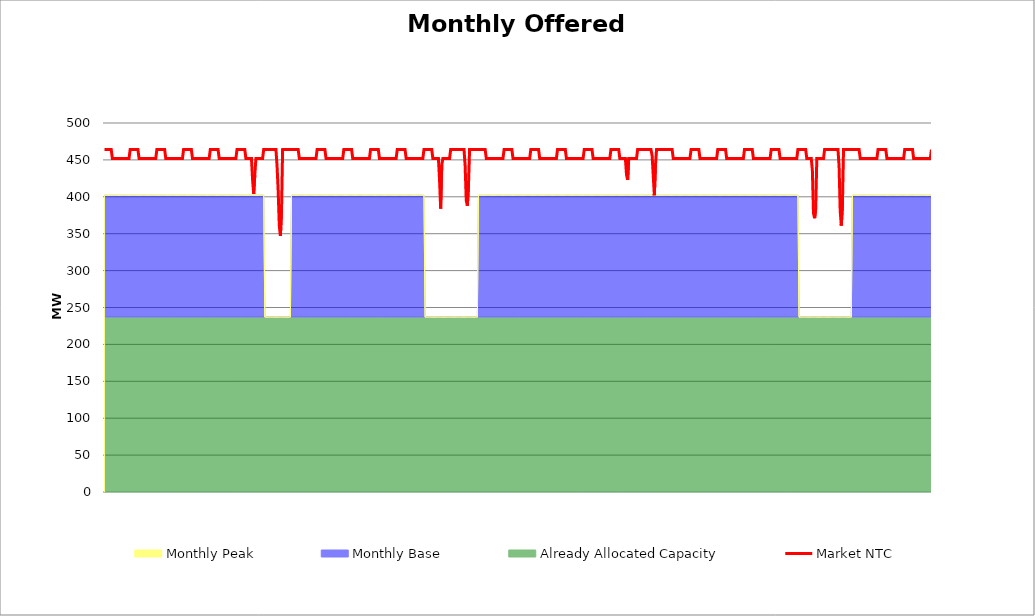
| Category | Market NTC |
|---|---|
| 0 | 464 |
| 1 | 464 |
| 2 | 464 |
| 3 | 464 |
| 4 | 464 |
| 5 | 464 |
| 6 | 464 |
| 7 | 452 |
| 8 | 452 |
| 9 | 452 |
| 10 | 452 |
| 11 | 452 |
| 12 | 452 |
| 13 | 452 |
| 14 | 452 |
| 15 | 452 |
| 16 | 452 |
| 17 | 452 |
| 18 | 452 |
| 19 | 452 |
| 20 | 452 |
| 21 | 452 |
| 22 | 452 |
| 23 | 464 |
| 24 | 464 |
| 25 | 464 |
| 26 | 464 |
| 27 | 464 |
| 28 | 464 |
| 29 | 464 |
| 30 | 464 |
| 31 | 452 |
| 32 | 452 |
| 33 | 452 |
| 34 | 452 |
| 35 | 452 |
| 36 | 452 |
| 37 | 452 |
| 38 | 452 |
| 39 | 452 |
| 40 | 452 |
| 41 | 452 |
| 42 | 452 |
| 43 | 452 |
| 44 | 452 |
| 45 | 452 |
| 46 | 452 |
| 47 | 464 |
| 48 | 464 |
| 49 | 464 |
| 50 | 464 |
| 51 | 464 |
| 52 | 464 |
| 53 | 464 |
| 54 | 464 |
| 55 | 452 |
| 56 | 452 |
| 57 | 452 |
| 58 | 452 |
| 59 | 452 |
| 60 | 452 |
| 61 | 452 |
| 62 | 452 |
| 63 | 452 |
| 64 | 452 |
| 65 | 452 |
| 66 | 452 |
| 67 | 452 |
| 68 | 452 |
| 69 | 452 |
| 70 | 452 |
| 71 | 464 |
| 72 | 464 |
| 73 | 464 |
| 74 | 464 |
| 75 | 464 |
| 76 | 464 |
| 77 | 464 |
| 78 | 464 |
| 79 | 452 |
| 80 | 452 |
| 81 | 452 |
| 82 | 452 |
| 83 | 452 |
| 84 | 452 |
| 85 | 452 |
| 86 | 452 |
| 87 | 452 |
| 88 | 452 |
| 89 | 452 |
| 90 | 452 |
| 91 | 452 |
| 92 | 452 |
| 93 | 452 |
| 94 | 452 |
| 95 | 464 |
| 96 | 464 |
| 97 | 464 |
| 98 | 464 |
| 99 | 464 |
| 100 | 464 |
| 101 | 464 |
| 102 | 464 |
| 103 | 452 |
| 104 | 452 |
| 105 | 452 |
| 106 | 452 |
| 107 | 452 |
| 108 | 452 |
| 109 | 452 |
| 110 | 452 |
| 111 | 452 |
| 112 | 452 |
| 113 | 452 |
| 114 | 452 |
| 115 | 452 |
| 116 | 452 |
| 117 | 452 |
| 118 | 452 |
| 119 | 464 |
| 120 | 464 |
| 121 | 464 |
| 122 | 464 |
| 123 | 464 |
| 124 | 464 |
| 125 | 464 |
| 126 | 464 |
| 127 | 452 |
| 128 | 452 |
| 129 | 452 |
| 130 | 452 |
| 131 | 452 |
| 132 | 452 |
| 133 | 423 |
| 134 | 404 |
| 135 | 430 |
| 136 | 452 |
| 137 | 452 |
| 138 | 452 |
| 139 | 452 |
| 140 | 452 |
| 141 | 452 |
| 142 | 452 |
| 143 | 464 |
| 144 | 464 |
| 145 | 464 |
| 146 | 464 |
| 147 | 464 |
| 148 | 464 |
| 149 | 464 |
| 150 | 464 |
| 151 | 464 |
| 152 | 464 |
| 153 | 464 |
| 154 | 464 |
| 155 | 442 |
| 156 | 408 |
| 157 | 361 |
| 158 | 347 |
| 159 | 381 |
| 160 | 464 |
| 161 | 464 |
| 162 | 464 |
| 163 | 464 |
| 164 | 464 |
| 165 | 464 |
| 166 | 464 |
| 167 | 464 |
| 168 | 464 |
| 169 | 464 |
| 170 | 464 |
| 171 | 464 |
| 172 | 464 |
| 173 | 464 |
| 174 | 464 |
| 175 | 452 |
| 176 | 452 |
| 177 | 452 |
| 178 | 452 |
| 179 | 452 |
| 180 | 452 |
| 181 | 452 |
| 182 | 452 |
| 183 | 452 |
| 184 | 452 |
| 185 | 452 |
| 186 | 452 |
| 187 | 452 |
| 188 | 452 |
| 189 | 452 |
| 190 | 452 |
| 191 | 464 |
| 192 | 464 |
| 193 | 464 |
| 194 | 464 |
| 195 | 464 |
| 196 | 464 |
| 197 | 464 |
| 198 | 464 |
| 199 | 452 |
| 200 | 452 |
| 201 | 452 |
| 202 | 452 |
| 203 | 452 |
| 204 | 452 |
| 205 | 452 |
| 206 | 452 |
| 207 | 452 |
| 208 | 452 |
| 209 | 452 |
| 210 | 452 |
| 211 | 452 |
| 212 | 452 |
| 213 | 452 |
| 214 | 452 |
| 215 | 464 |
| 216 | 464 |
| 217 | 464 |
| 218 | 464 |
| 219 | 464 |
| 220 | 464 |
| 221 | 464 |
| 222 | 464 |
| 223 | 452 |
| 224 | 452 |
| 225 | 452 |
| 226 | 452 |
| 227 | 452 |
| 228 | 452 |
| 229 | 452 |
| 230 | 452 |
| 231 | 452 |
| 232 | 452 |
| 233 | 452 |
| 234 | 452 |
| 235 | 452 |
| 236 | 452 |
| 237 | 452 |
| 238 | 452 |
| 239 | 464 |
| 240 | 464 |
| 241 | 464 |
| 242 | 464 |
| 243 | 464 |
| 244 | 464 |
| 245 | 464 |
| 246 | 464 |
| 247 | 452 |
| 248 | 452 |
| 249 | 452 |
| 250 | 452 |
| 251 | 452 |
| 252 | 452 |
| 253 | 452 |
| 254 | 452 |
| 255 | 452 |
| 256 | 452 |
| 257 | 452 |
| 258 | 452 |
| 259 | 452 |
| 260 | 452 |
| 261 | 452 |
| 262 | 452 |
| 263 | 464 |
| 264 | 464 |
| 265 | 464 |
| 266 | 464 |
| 267 | 464 |
| 268 | 464 |
| 269 | 464 |
| 270 | 464 |
| 271 | 452 |
| 272 | 452 |
| 273 | 452 |
| 274 | 452 |
| 275 | 452 |
| 276 | 452 |
| 277 | 452 |
| 278 | 452 |
| 279 | 452 |
| 280 | 452 |
| 281 | 452 |
| 282 | 452 |
| 283 | 452 |
| 284 | 452 |
| 285 | 452 |
| 286 | 452 |
| 287 | 464 |
| 288 | 464 |
| 289 | 464 |
| 290 | 464 |
| 291 | 464 |
| 292 | 464 |
| 293 | 464 |
| 294 | 464 |
| 295 | 452 |
| 296 | 452 |
| 297 | 452 |
| 298 | 452 |
| 299 | 452 |
| 300 | 452 |
| 301 | 423 |
| 302 | 384 |
| 303 | 443 |
| 304 | 452 |
| 305 | 452 |
| 306 | 452 |
| 307 | 452 |
| 308 | 452 |
| 309 | 452 |
| 310 | 452 |
| 311 | 464 |
| 312 | 464 |
| 313 | 464 |
| 314 | 464 |
| 315 | 464 |
| 316 | 464 |
| 317 | 464 |
| 318 | 464 |
| 319 | 464 |
| 320 | 464 |
| 321 | 464 |
| 322 | 464 |
| 323 | 464 |
| 324 | 442 |
| 325 | 395 |
| 326 | 388 |
| 327 | 415 |
| 328 | 464 |
| 329 | 464 |
| 330 | 464 |
| 331 | 464 |
| 332 | 464 |
| 333 | 464 |
| 334 | 464 |
| 335 | 464 |
| 336 | 464 |
| 337 | 464 |
| 338 | 464 |
| 339 | 464 |
| 340 | 464 |
| 341 | 464 |
| 342 | 464 |
| 343 | 452 |
| 344 | 452 |
| 345 | 452 |
| 346 | 452 |
| 347 | 452 |
| 348 | 452 |
| 349 | 452 |
| 350 | 452 |
| 351 | 452 |
| 352 | 452 |
| 353 | 452 |
| 354 | 452 |
| 355 | 452 |
| 356 | 452 |
| 357 | 452 |
| 358 | 452 |
| 359 | 464 |
| 360 | 464 |
| 361 | 464 |
| 362 | 464 |
| 363 | 464 |
| 364 | 464 |
| 365 | 464 |
| 366 | 464 |
| 367 | 452 |
| 368 | 452 |
| 369 | 452 |
| 370 | 452 |
| 371 | 452 |
| 372 | 452 |
| 373 | 452 |
| 374 | 452 |
| 375 | 452 |
| 376 | 452 |
| 377 | 452 |
| 378 | 452 |
| 379 | 452 |
| 380 | 452 |
| 381 | 452 |
| 382 | 452 |
| 383 | 464 |
| 384 | 464 |
| 385 | 464 |
| 386 | 464 |
| 387 | 464 |
| 388 | 464 |
| 389 | 464 |
| 390 | 464 |
| 391 | 452 |
| 392 | 452 |
| 393 | 452 |
| 394 | 452 |
| 395 | 452 |
| 396 | 452 |
| 397 | 452 |
| 398 | 452 |
| 399 | 452 |
| 400 | 452 |
| 401 | 452 |
| 402 | 452 |
| 403 | 452 |
| 404 | 452 |
| 405 | 452 |
| 406 | 452 |
| 407 | 464 |
| 408 | 464 |
| 409 | 464 |
| 410 | 464 |
| 411 | 464 |
| 412 | 464 |
| 413 | 464 |
| 414 | 464 |
| 415 | 452 |
| 416 | 452 |
| 417 | 452 |
| 418 | 452 |
| 419 | 452 |
| 420 | 452 |
| 421 | 452 |
| 422 | 452 |
| 423 | 452 |
| 424 | 452 |
| 425 | 452 |
| 426 | 452 |
| 427 | 452 |
| 428 | 452 |
| 429 | 452 |
| 430 | 452 |
| 431 | 464 |
| 432 | 464 |
| 433 | 464 |
| 434 | 464 |
| 435 | 464 |
| 436 | 464 |
| 437 | 464 |
| 438 | 464 |
| 439 | 452 |
| 440 | 452 |
| 441 | 452 |
| 442 | 452 |
| 443 | 452 |
| 444 | 452 |
| 445 | 452 |
| 446 | 452 |
| 447 | 452 |
| 448 | 452 |
| 449 | 452 |
| 450 | 452 |
| 451 | 452 |
| 452 | 452 |
| 453 | 452 |
| 454 | 452 |
| 455 | 464 |
| 456 | 464 |
| 457 | 464 |
| 458 | 464 |
| 459 | 464 |
| 460 | 464 |
| 461 | 464 |
| 462 | 464 |
| 463 | 452 |
| 464 | 452 |
| 465 | 452 |
| 466 | 452 |
| 467 | 452 |
| 468 | 452 |
| 469 | 430 |
| 470 | 423 |
| 471 | 452 |
| 472 | 452 |
| 473 | 452 |
| 474 | 452 |
| 475 | 452 |
| 476 | 452 |
| 477 | 452 |
| 478 | 452 |
| 479 | 464 |
| 480 | 464 |
| 481 | 464 |
| 482 | 464 |
| 483 | 464 |
| 484 | 464 |
| 485 | 464 |
| 486 | 464 |
| 487 | 464 |
| 488 | 464 |
| 489 | 464 |
| 490 | 464 |
| 491 | 464 |
| 492 | 456 |
| 493 | 429 |
| 494 | 402 |
| 495 | 442 |
| 496 | 464 |
| 497 | 464 |
| 498 | 464 |
| 499 | 464 |
| 500 | 464 |
| 501 | 464 |
| 502 | 464 |
| 503 | 464 |
| 504 | 464 |
| 505 | 464 |
| 506 | 464 |
| 507 | 464 |
| 508 | 464 |
| 509 | 464 |
| 510 | 464 |
| 511 | 452 |
| 512 | 452 |
| 513 | 452 |
| 514 | 452 |
| 515 | 452 |
| 516 | 452 |
| 517 | 452 |
| 518 | 452 |
| 519 | 452 |
| 520 | 452 |
| 521 | 452 |
| 522 | 452 |
| 523 | 452 |
| 524 | 452 |
| 525 | 452 |
| 526 | 452 |
| 527 | 464 |
| 528 | 464 |
| 529 | 464 |
| 530 | 464 |
| 531 | 464 |
| 532 | 464 |
| 533 | 464 |
| 534 | 464 |
| 535 | 452 |
| 536 | 452 |
| 537 | 452 |
| 538 | 452 |
| 539 | 452 |
| 540 | 452 |
| 541 | 452 |
| 542 | 452 |
| 543 | 452 |
| 544 | 452 |
| 545 | 452 |
| 546 | 452 |
| 547 | 452 |
| 548 | 452 |
| 549 | 452 |
| 550 | 452 |
| 551 | 464 |
| 552 | 464 |
| 553 | 464 |
| 554 | 464 |
| 555 | 464 |
| 556 | 464 |
| 557 | 464 |
| 558 | 464 |
| 559 | 452 |
| 560 | 452 |
| 561 | 452 |
| 562 | 452 |
| 563 | 452 |
| 564 | 452 |
| 565 | 452 |
| 566 | 452 |
| 567 | 452 |
| 568 | 452 |
| 569 | 452 |
| 570 | 452 |
| 571 | 452 |
| 572 | 452 |
| 573 | 452 |
| 574 | 452 |
| 575 | 464 |
| 576 | 464 |
| 577 | 464 |
| 578 | 464 |
| 579 | 464 |
| 580 | 464 |
| 581 | 464 |
| 582 | 464 |
| 583 | 452 |
| 584 | 452 |
| 585 | 452 |
| 586 | 452 |
| 587 | 452 |
| 588 | 452 |
| 589 | 452 |
| 590 | 452 |
| 591 | 452 |
| 592 | 452 |
| 593 | 452 |
| 594 | 452 |
| 595 | 452 |
| 596 | 452 |
| 597 | 452 |
| 598 | 452 |
| 599 | 464 |
| 600 | 464 |
| 601 | 464 |
| 602 | 464 |
| 603 | 464 |
| 604 | 464 |
| 605 | 464 |
| 606 | 464 |
| 607 | 452 |
| 608 | 452 |
| 609 | 452 |
| 610 | 452 |
| 611 | 452 |
| 612 | 452 |
| 613 | 452 |
| 614 | 452 |
| 615 | 452 |
| 616 | 452 |
| 617 | 452 |
| 618 | 452 |
| 619 | 452 |
| 620 | 452 |
| 621 | 452 |
| 622 | 452 |
| 623 | 464 |
| 624 | 464 |
| 625 | 464 |
| 626 | 464 |
| 627 | 464 |
| 628 | 464 |
| 629 | 464 |
| 630 | 464 |
| 631 | 452 |
| 632 | 452 |
| 633 | 452 |
| 634 | 452 |
| 635 | 452 |
| 636 | 436 |
| 637 | 378 |
| 638 | 371 |
| 639 | 384 |
| 640 | 452 |
| 641 | 452 |
| 642 | 452 |
| 643 | 452 |
| 644 | 452 |
| 645 | 452 |
| 646 | 452 |
| 647 | 464 |
| 648 | 464 |
| 649 | 464 |
| 650 | 464 |
| 651 | 464 |
| 652 | 464 |
| 653 | 464 |
| 654 | 464 |
| 655 | 464 |
| 656 | 464 |
| 657 | 464 |
| 658 | 464 |
| 659 | 464 |
| 660 | 442 |
| 661 | 381 |
| 662 | 361 |
| 663 | 388 |
| 664 | 464 |
| 665 | 464 |
| 666 | 464 |
| 667 | 464 |
| 668 | 464 |
| 669 | 464 |
| 670 | 464 |
| 671 | 464 |
| 672 | 464 |
| 673 | 464 |
| 674 | 464 |
| 675 | 464 |
| 676 | 464 |
| 677 | 464 |
| 678 | 464 |
| 679 | 452 |
| 680 | 452 |
| 681 | 452 |
| 682 | 452 |
| 683 | 452 |
| 684 | 452 |
| 685 | 452 |
| 686 | 452 |
| 687 | 452 |
| 688 | 452 |
| 689 | 452 |
| 690 | 452 |
| 691 | 452 |
| 692 | 452 |
| 693 | 452 |
| 694 | 452 |
| 695 | 464 |
| 696 | 464 |
| 697 | 464 |
| 698 | 464 |
| 699 | 464 |
| 700 | 464 |
| 701 | 464 |
| 702 | 464 |
| 703 | 452 |
| 704 | 452 |
| 705 | 452 |
| 706 | 452 |
| 707 | 452 |
| 708 | 452 |
| 709 | 452 |
| 710 | 452 |
| 711 | 452 |
| 712 | 452 |
| 713 | 452 |
| 714 | 452 |
| 715 | 452 |
| 716 | 452 |
| 717 | 452 |
| 718 | 452 |
| 719 | 464 |
| 720 | 464 |
| 721 | 464 |
| 722 | 464 |
| 723 | 464 |
| 724 | 464 |
| 725 | 464 |
| 726 | 464 |
| 727 | 452 |
| 728 | 452 |
| 729 | 452 |
| 730 | 452 |
| 731 | 452 |
| 732 | 452 |
| 733 | 452 |
| 734 | 452 |
| 735 | 452 |
| 736 | 452 |
| 737 | 452 |
| 738 | 452 |
| 739 | 452 |
| 740 | 452 |
| 741 | 452 |
| 742 | 452 |
| 743 | 464 |